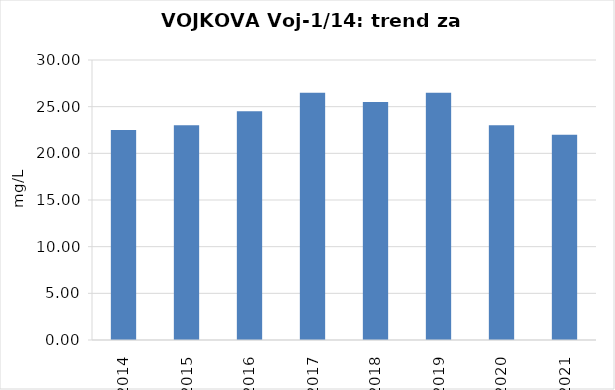
| Category | Vsota |
|---|---|
| 2014 | 22.5 |
| 2015 | 23 |
| 2016 | 24.5 |
| 2017 | 26.5 |
| 2018 | 25.5 |
| 2019 | 26.5 |
| 2020 | 23 |
| 2021 | 22 |